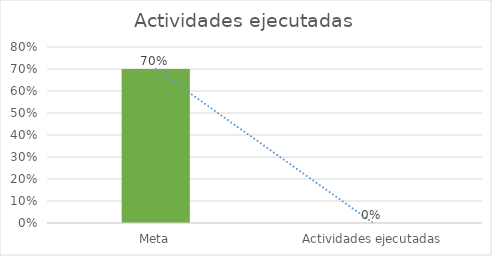
| Category | Series 0 |
|---|---|
| Meta | 0.7 |
| Actividades ejecutadas | 0 |